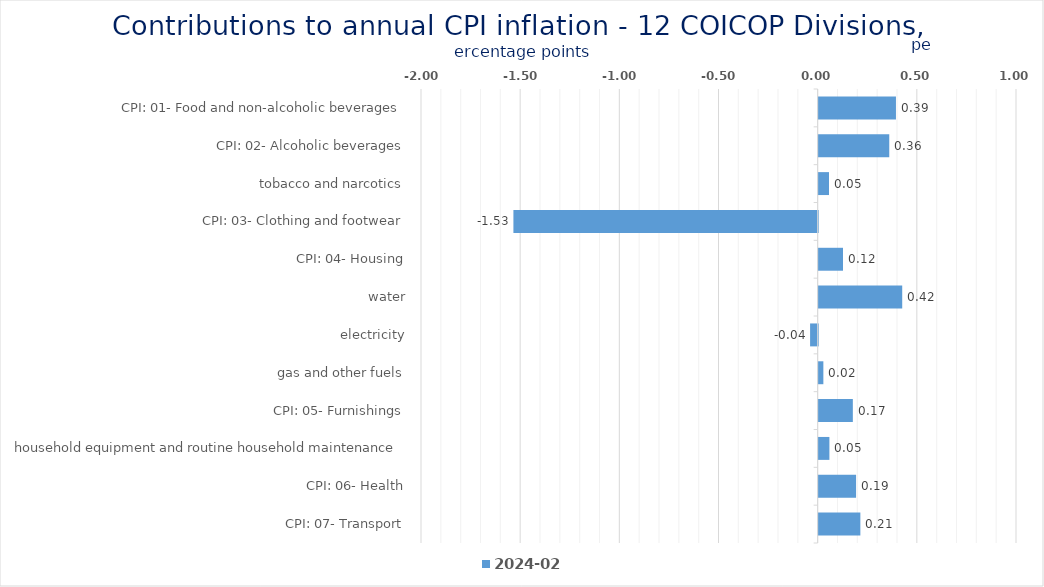
| Category | 2024-02 |
|---|---|
| CPI: 01- Food and non-alcoholic beverages | 0.39 |
| CPI: 02- Alcoholic beverages, tobacco and narcotics | 0.356 |
| CPI: 03- Clothing and footwear | 0.052 |
| CPI: 04- Housing, water, electricity, gas and other fuels | -1.534 |
| CPI: 05- Furnishings, household equipment and routine household maintenance | 0.123 |
| CPI: 06- Health | 0.421 |
| CPI: 07- Transport | -0.038 |
| CPI: 08- Communication | 0.024 |
| CPI: 09- Recreation and culture | 0.172 |
| CPI: 10- Education | 0.054 |
| CPI: 11- Restaurants and hotels | 0.189 |
| CPI: 12- Miscellaneous goods and services | 0.21 |